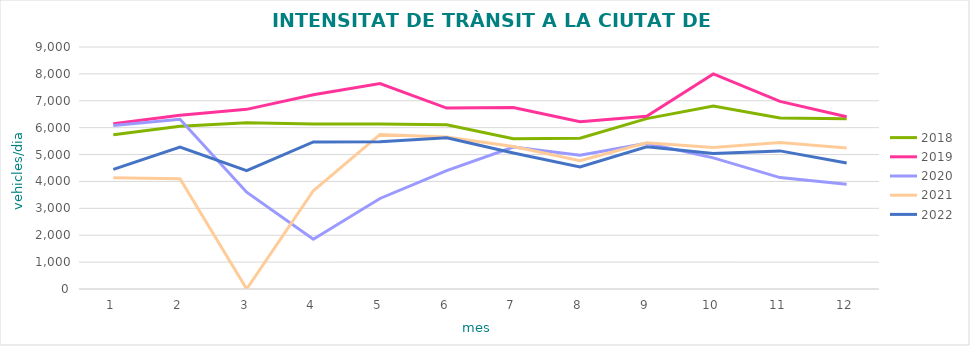
| Category | 2018 | 2019 | 2020 | 2021 | 2022 |
|---|---|---|---|---|---|
| 0 | 5738.803 | 6142.693 | 6080.72 | 4139.6 | 4451.627 |
| 1 | 6055.439 | 6460.333 | 6310.587 | 4096.6 | 5275.152 |
| 2 | 6183.924 | 6680.768 | 3601.594 | 0 | 4401.192 |
| 3 | 6137.145 | 7221.188 | 1847.675 | 3653.733 | 5468.519 |
| 4 | 6133.188 | 7637.377 | 3366.964 | 5747.547 | 5477.02 |
| 5 | 6105.522 | 6729.16 | 4405.945 | 5656.427 | 5627.379 |
| 6 | 5584.942 | 6752.787 | 5278.683 | 5301.413 | 5057.364 |
| 7 | 5607.427 | 6219.507 | 4977.571 | 4771.773 | 4539.462 |
| 8 | 6337 | 6422.253 | 5420.101 | 5436.072 | 5286.527 |
| 9 | 6802.147 | 8000 | 4877.533 | 5265.12 | 5040.023 |
| 10 | 6360.267 | 6978.44 | 4142.36 | 5452.613 | 5136.276 |
| 11 | 6334.987 | 6407.653 | 3892.947 | 5245.873 | 4682.75 |